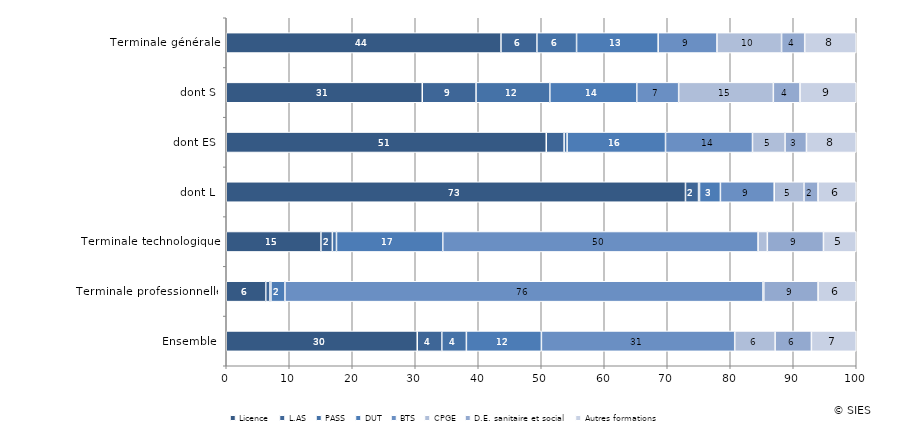
| Category | Licence | L.AS | PASS | DUT | BTS | CPGE | D.E. sanitaire et social | Autres formations  |
|---|---|---|---|---|---|---|---|---|
| Ensemble | 30.315 | 3.899 | 3.901 | 11.908 | 30.684 | 6.412 | 5.763 | 7.117 |
| Terminale professionnelle | 6.269 | 0.64 | 0.184 | 2.221 | 75.892 | 0.121 | 8.615 | 6.058 |
| Terminale technologique | 15.026 | 1.817 | 0.652 | 16.872 | 50.05 | 1.47 | 8.909 | 5.204 |
| dont L | 72.894 | 2.076 | 0.15 | 3.319 | 8.536 | 4.725 | 2.23 | 6.071 |
| dont ES | 50.795 | 2.831 | 0.478 | 15.618 | 13.806 | 5.166 | 3.398 | 7.906 |
| dont S | 31.113 | 8.537 | 11.713 | 13.8 | 6.649 | 15.029 | 4.232 | 8.927 |
| Terminale générale | 43.604 | 5.705 | 6.298 | 12.952 | 9.334 | 10.253 | 3.67 | 8.183 |